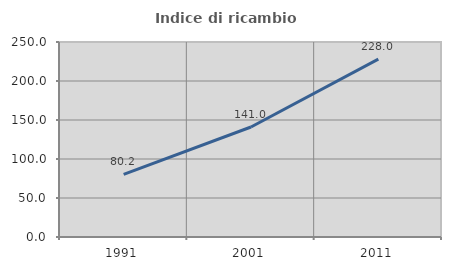
| Category | Indice di ricambio occupazionale  |
|---|---|
| 1991.0 | 80.22 |
| 2001.0 | 141.037 |
| 2011.0 | 227.981 |